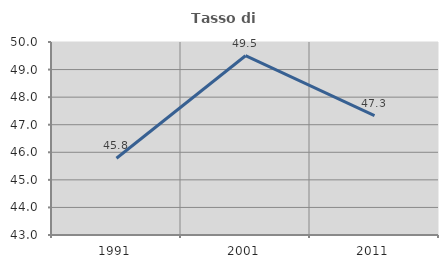
| Category | Tasso di occupazione   |
|---|---|
| 1991.0 | 45.785 |
| 2001.0 | 49.503 |
| 2011.0 | 47.327 |